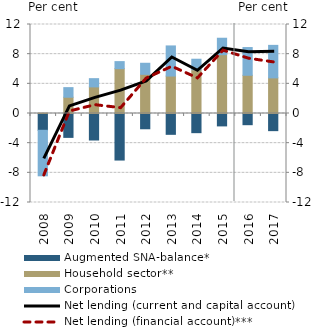
| Category | Augmented SNA-balance* | Household sector** | Corporations |
|---|---|---|---|
| 2008.0 | -2.264 | 0.05 | -6.137 |
| 2009.0 | -3.22 | 2.193 | 1.295 |
| 2010.0 | -3.574 | 3.586 | 1.114 |
| 2011.0 | -6.277 | 6.046 | 0.95 |
| 2012.0 | -2.058 | 5.28 | 1.493 |
| 2013.0 | -2.809 | 5.05 | 4.061 |
| 2014.0 | -2.584 | 5.898 | 1.42 |
| 2015.0 | -1.672 | 7.931 | 2.217 |
| 2016.0 | -1.509 | 5.153 | 3.74 |
| 2017.0 | -2.311 | 4.804 | 4.382 |